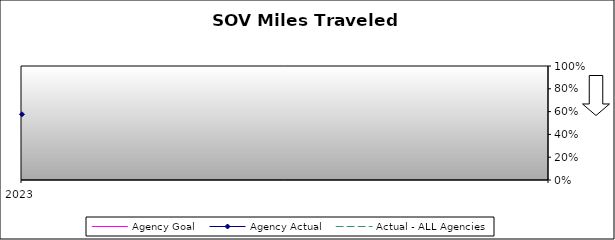
| Category | Agency Goal | Agency Actual | Actual - ALL Agencies |
|---|---|---|---|
| 2023.0 | 0.6 | 0.576 | 0.454 |